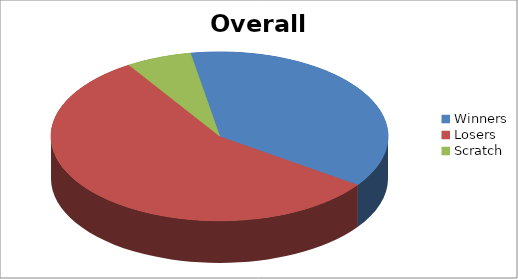
| Category | Series 1 |
|---|---|
| Winners | 12 |
| Losers | 18 |
| Scratch | 2 |